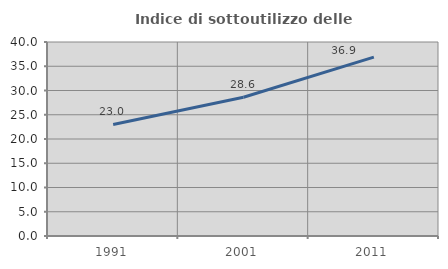
| Category | Indice di sottoutilizzo delle abitazioni  |
|---|---|
| 1991.0 | 23.003 |
| 2001.0 | 28.611 |
| 2011.0 | 36.874 |